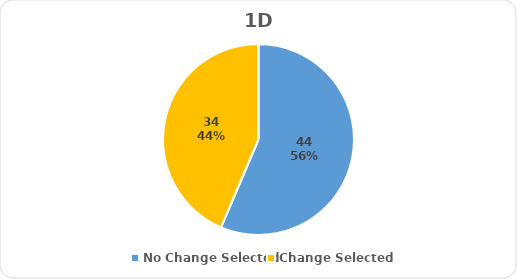
| Category | Series 0 |
|---|---|
| No Change Selected | 44 |
| Change Selected | 34 |